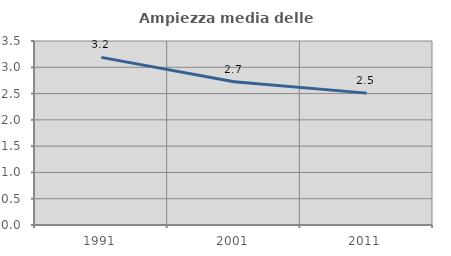
| Category | Ampiezza media delle famiglie |
|---|---|
| 1991.0 | 3.189 |
| 2001.0 | 2.725 |
| 2011.0 | 2.509 |